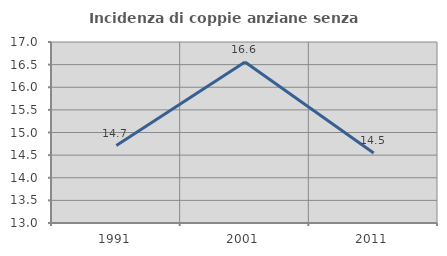
| Category | Incidenza di coppie anziane senza figli  |
|---|---|
| 1991.0 | 14.712 |
| 2001.0 | 16.559 |
| 2011.0 | 14.545 |